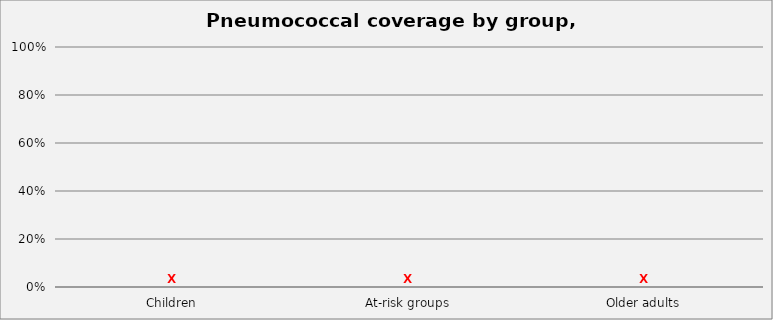
| Category | Series 0 |
|---|---|
| Children | 0 |
| At-risk groups | 0 |
| Older adults | 0 |